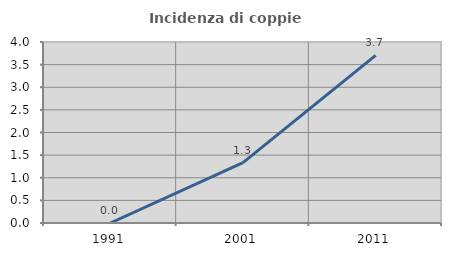
| Category | Incidenza di coppie miste |
|---|---|
| 1991.0 | 0 |
| 2001.0 | 1.333 |
| 2011.0 | 3.704 |